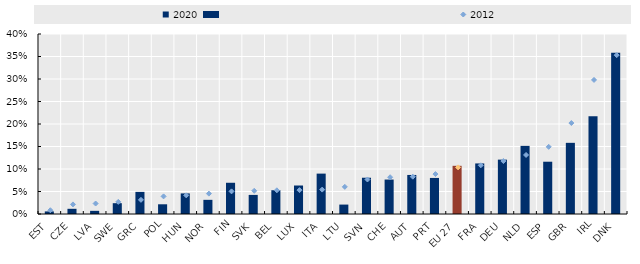
| Category | 2020 |
|---|---|
| EST | 0.006 |
| CZE | 0.012 |
| LVA | 0.007 |
| SWE | 0.024 |
| GRC | 0.049 |
| POL | 0.022 |
| HUN | 0.046 |
| NOR | 0.031 |
| FIN | 0.069 |
| SVK | 0.042 |
| BEL | 0.053 |
| LUX | 0.063 |
| ITA | 0.09 |
| LTU | 0.021 |
| SVN | 0.081 |
| CHE | 0.077 |
| AUT | 0.087 |
| PRT | 0.08 |
| EU 27 | 0.107 |
| FRA | 0.112 |
| DEU | 0.121 |
| NLD | 0.151 |
| ESP | 0.116 |
| GBR | 0.158 |
| IRL | 0.217 |
| DNK | 0.358 |